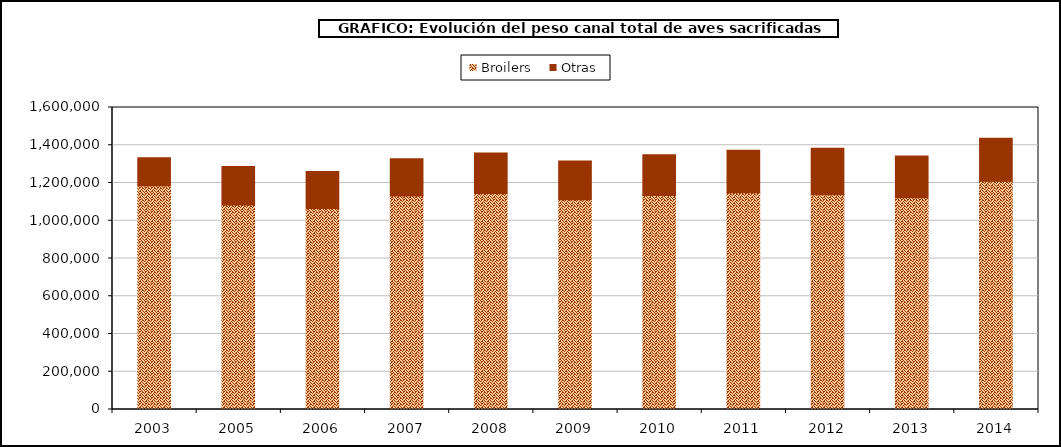
| Category | Broilers | Otras |
|---|---|---|
| 2003.0 | 1185382.351 | 147954.456 |
| 2005.0 | 1083967.626 | 203454.751 |
| 2006.0 | 1064943.635 | 195909.128 |
| 2007.0 | 1131030.91 | 197060.388 |
| 2008.0 | 1144285.376 | 214254.063 |
| 2009.0 | 1111683.614 | 204985.916 |
| 2010.0 | 1133430.435 | 215999.184 |
| 2011.0 | 1148388.725 | 225215.047 |
| 2012.0 | 1137190.775 | 247051.951 |
| 2013.0 | 1121294.618 | 221283.736 |
| 2014.0 | 1209068.651 | 227620.21 |